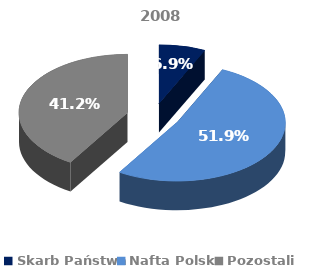
| Category | 2008 |
|---|---|
| Skarb Państwa | 0.069 |
| Nafta Polska | 0.519 |
| Pozostali | 0.412 |